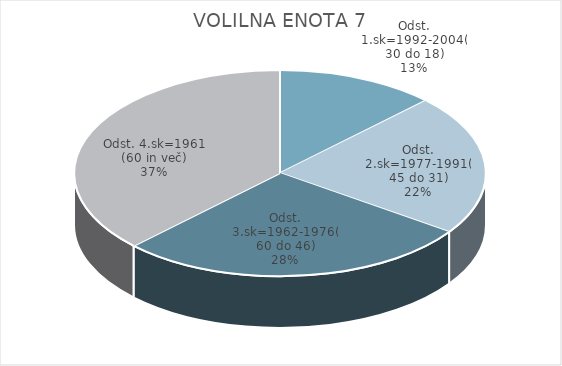
| Category | VOLILNA ENOTA 7 |
|---|---|
| Odst. 1.sk=1992-2004(30 do 18) | 8.4 |
| Odst. 2.sk=1977-1991(45 do 31) | 14.81 |
| Odst. 3.sk=1962-1976(60 do 46) | 18.66 |
| Odst. 4.sk=1961 (60 in več) | 25.06 |